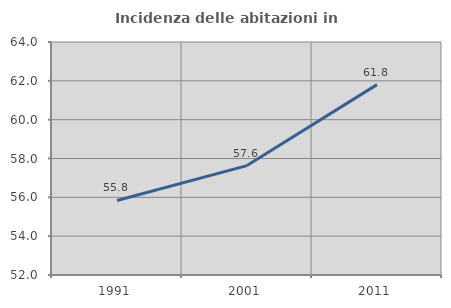
| Category | Incidenza delle abitazioni in proprietà  |
|---|---|
| 1991.0 | 55.838 |
| 2001.0 | 57.635 |
| 2011.0 | 61.806 |